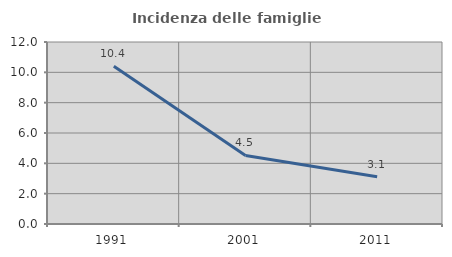
| Category | Incidenza delle famiglie numerose |
|---|---|
| 1991.0 | 10.399 |
| 2001.0 | 4.519 |
| 2011.0 | 3.119 |